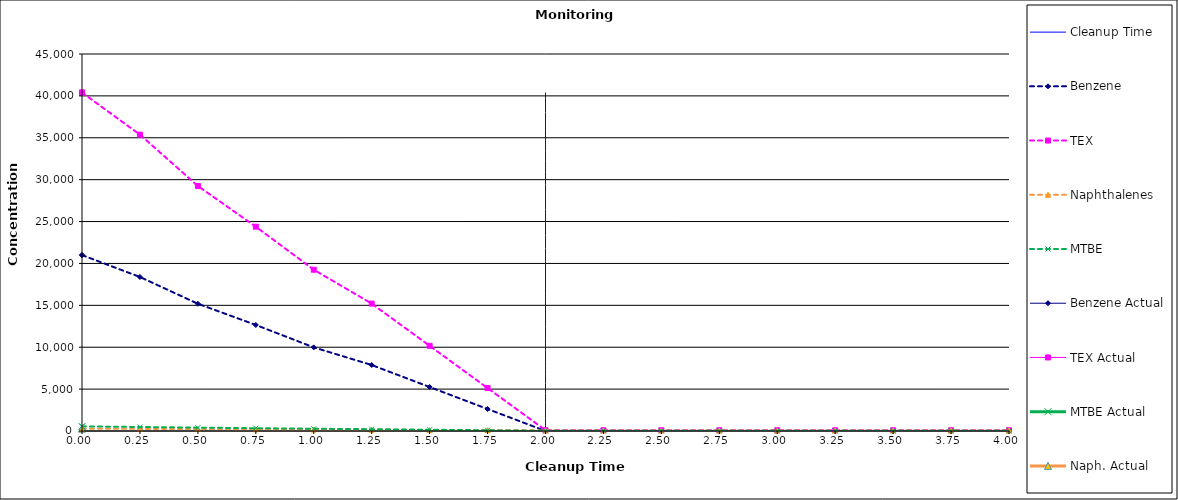
| Category | Cleanup Time |
|---|---|
| 2.0 | 0 |
| 2.0 | 40400 |